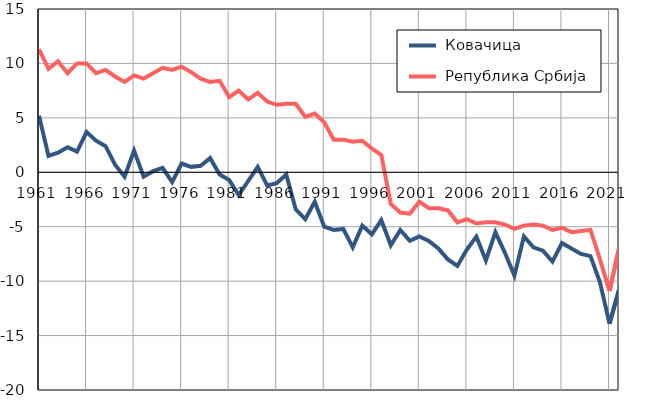
| Category |  Ковачица |  Република Србија |
|---|---|---|
| 1961.0 | 5.2 | 11.3 |
| 1962.0 | 1.5 | 9.5 |
| 1963.0 | 1.8 | 10.2 |
| 1964.0 | 2.3 | 9.1 |
| 1965.0 | 1.9 | 10 |
| 1966.0 | 3.7 | 10 |
| 1967.0 | 2.9 | 9.1 |
| 1968.0 | 2.4 | 9.4 |
| 1969.0 | 0.7 | 8.8 |
| 1970.0 | -0.4 | 8.3 |
| 1971.0 | 2 | 8.9 |
| 1972.0 | -0.4 | 8.6 |
| 1973.0 | 0.1 | 9.1 |
| 1974.0 | 0.4 | 9.6 |
| 1975.0 | -0.9 | 9.4 |
| 1976.0 | 0.8 | 9.7 |
| 1977.0 | 0.5 | 9.2 |
| 1978.0 | 0.6 | 8.6 |
| 1979.0 | 1.3 | 8.3 |
| 1980.0 | -0.2 | 8.4 |
| 1981.0 | -0.7 | 6.9 |
| 1982.0 | -2.1 | 7.5 |
| 1983.0 | -0.8 | 6.7 |
| 1984.0 | 0.5 | 7.3 |
| 1985.0 | -1.2 | 6.5 |
| 1986.0 | -1 | 6.2 |
| 1987.0 | -0.2 | 6.3 |
| 1988.0 | -3.4 | 6.3 |
| 1989.0 | -4.3 | 5.1 |
| 1990.0 | -2.7 | 5.4 |
| 1991.0 | -5 | 4.6 |
| 1992.0 | -5.3 | 3 |
| 1993.0 | -5.2 | 3 |
| 1994.0 | -6.9 | 2.8 |
| 1995.0 | -4.9 | 2.9 |
| 1996.0 | -5.7 | 2.2 |
| 1997.0 | -4.4 | 1.6 |
| 1998.0 | -6.7 | -2.9 |
| 1999.0 | -5.3 | -3.7 |
| 2000.0 | -6.3 | -3.8 |
| 2001.0 | -5.9 | -2.7 |
| 2002.0 | -6.3 | -3.3 |
| 2003.0 | -7 | -3.3 |
| 2004.0 | -8 | -3.5 |
| 2005.0 | -8.6 | -4.6 |
| 2006.0 | -7.1 | -4.3 |
| 2007.0 | -5.9 | -4.7 |
| 2008.0 | -8.1 | -4.6 |
| 2009.0 | -5.5 | -4.6 |
| 2010.0 | -7.4 | -4.8 |
| 2011.0 | -9.5 | -5.2 |
| 2012.0 | -5.9 | -4.9 |
| 2013.0 | -6.9 | -4.8 |
| 2014.0 | -7.2 | -4.9 |
| 2015.0 | -8.2 | -5.3 |
| 2016.0 | -6.5 | -5.1 |
| 2017.0 | -7 | -5.5 |
| 2018.0 | -7.5 | -5.4 |
| 2019.0 | -7.7 | -5.3 |
| 2020.0 | -10.1 | -8 |
| 2021.0 | -13.9 | -10.9 |
| 2022.0 | -10.8 | -7 |